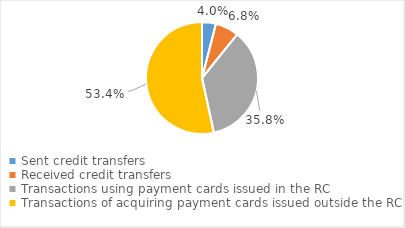
| Category | Series 0 |
|---|---|
| Sent credit transfers | 4080576 |
| Received credit transfers | 6918035 |
| Transactions using payment cards issued in the RC | 36412495 |
| Transactions of acquiring payment cards issued outside the RC | 54354532 |